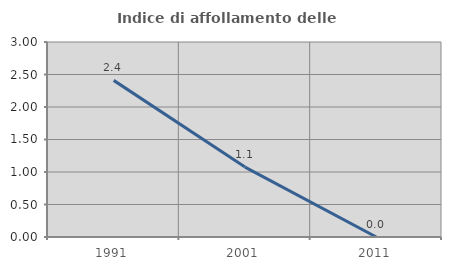
| Category | Indice di affollamento delle abitazioni  |
|---|---|
| 1991.0 | 2.41 |
| 2001.0 | 1.075 |
| 2011.0 | 0 |